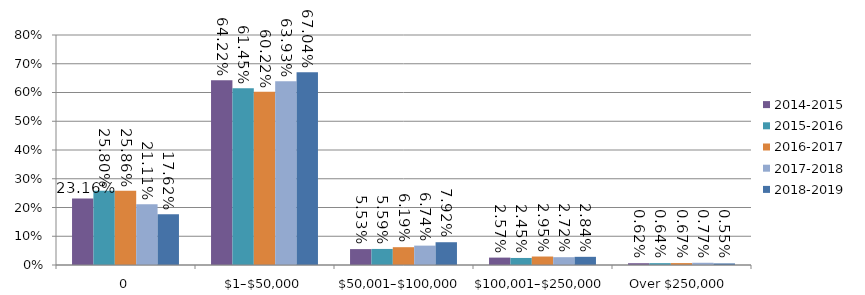
| Category | 2014-2015 | 2015-2016 | 2016-2017 | 2017-2018 | 2018-2019 |
|---|---|---|---|---|---|
| 0 | 0.232 | 0.258 | 0.259 | 0.211 | 0.176 |
| $1–$50,000 | 0.642 | 0.614 | 0.602 | 0.639 | 0.67 |
| $50,001–$100,000 | 0.055 | 0.056 | 0.062 | 0.067 | 0.079 |
| $100,001–$250,000 | 0.026 | 0.025 | 0.029 | 0.027 | 0.028 |
| Over $250,000 | 0.006 | 0.006 | 0.007 | 0.008 | 0.005 |